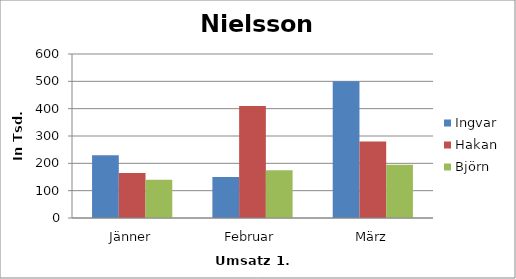
| Category | Ingvar | Hakan | Björn |
|---|---|---|---|
| Jänner | 230 | 165 | 140 |
| Februar | 150 | 410 | 175 |
| März | 500 | 280 | 195 |